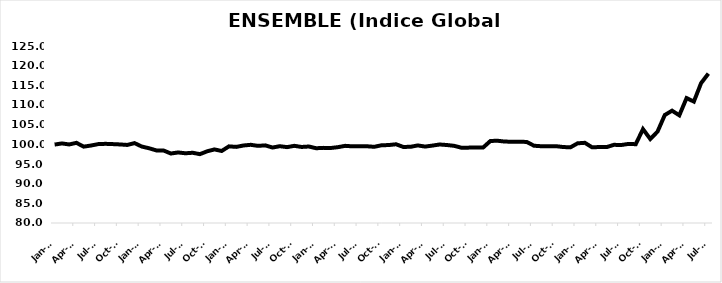
| Category | ENSEMBLE (Indice Global IPPI) |
|---|---|
| 2015-01-01 | 99.936 |
| 2015-02-01 | 100.233 |
| 2015-03-01 | 99.97 |
| 2015-04-01 | 100.379 |
| 2015-05-01 | 99.413 |
| 2015-06-01 | 99.694 |
| 2015-07-01 | 100.055 |
| 2015-08-01 | 100.127 |
| 2015-09-01 | 100.058 |
| 2015-10-01 | 99.973 |
| 2015-11-01 | 99.847 |
| 2015-12-01 | 100.315 |
| 2016-01-01 | 99.434 |
| 2016-02-01 | 99.004 |
| 2016-03-01 | 98.457 |
| 2016-04-01 | 98.429 |
| 2016-05-01 | 97.666 |
| 2016-06-01 | 97.933 |
| 2016-07-01 | 97.725 |
| 2016-08-01 | 97.856 |
| 2016-09-01 | 97.503 |
| 2016-10-01 | 98.227 |
| 2016-11-01 | 98.708 |
| 2016-12-01 | 98.31 |
| 2017-01-01 | 99.484 |
| 2017-02-01 | 99.349 |
| 2017-03-01 | 99.706 |
| 2017-04-01 | 99.88 |
| 2017-05-01 | 99.611 |
| 2017-06-01 | 99.738 |
| 2017-07-01 | 99.184 |
| 2017-08-01 | 99.528 |
| 2017-09-01 | 99.285 |
| 2017-10-01 | 99.621 |
| 2017-11-01 | 99.331 |
| 2017-12-01 | 99.446 |
| 2018-01-01 | 99.009 |
| 2018-02-01 | 99.101 |
| 2018-03-01 | 99.067 |
| 2018-04-01 | 99.277 |
| 2018-05-01 | 99.616 |
| 2018-06-01 | 99.494 |
| 2018-07-01 | 99.523 |
| 2018-08-01 | 99.509 |
| 2018-09-01 | 99.369 |
| 2018-10-01 | 99.76 |
| 2018-11-01 | 99.819 |
| 2018-12-01 | 100.017 |
| 2019-01-01 | 99.337 |
| 2019-02-01 | 99.372 |
| 2019-03-01 | 99.726 |
| 2019-04-01 | 99.427 |
| 2019-05-01 | 99.678 |
| 2019-06-01 | 99.959 |
| 2019-07-01 | 99.826 |
| 2019-08-01 | 99.62 |
| 2019-09-01 | 99.142 |
| 2019-10-01 | 99.162 |
| 2019-11-01 | 99.205 |
| 2019-12-01 | 99.205 |
| 2020-01-01 | 100.861 |
| 2020-02-01 | 100.903 |
| 2020-03-01 | 100.695 |
| 2020-04-01 | 100.675 |
| 2020-05-01 | 100.677 |
| 2020-06-01 | 100.601 |
| 2020-07-01 | 99.643 |
| 2020-08-01 | 99.517 |
| 2020-09-01 | 99.544 |
| 2020-10-01 | 99.531 |
| 2020-11-01 | 99.321 |
| 2020-12-01 | 99.228 |
| 2021-01-01 | 100.262 |
| 2021-02-01 | 100.388 |
| 2021-03-01 | 99.233 |
| 2021-04-01 | 99.322 |
| 2021-05-01 | 99.3 |
| 2021-06-01 | 99.876 |
| 2021-07-01 | 99.823 |
| 2021-08-01 | 100.109 |
| 2021-09-01 | 100.035 |
| 2021-10-01 | 103.866 |
| 2021-11-01 | 101.361 |
| 2021-12-01 | 103.228 |
| 2022-01-01 | 107.454 |
| 2022-02-01 | 108.557 |
| 2022-03-01 | 107.375 |
| 2022-04-01 | 111.76 |
| 2022-05-01 | 110.866 |
| 2022-06-01 | 115.562 |
| 2022-07-01 | 117.979 |